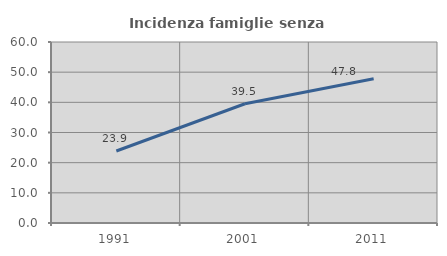
| Category | Incidenza famiglie senza nuclei |
|---|---|
| 1991.0 | 23.871 |
| 2001.0 | 39.535 |
| 2011.0 | 47.802 |